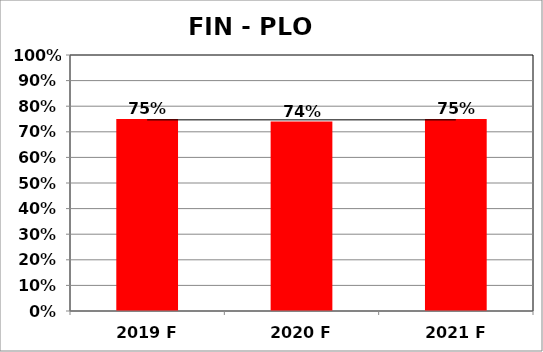
| Category | Series 0 |
|---|---|
| 2019 F | 0.75 |
| 2020 F | 0.74 |
| 2021 F | 0.75 |